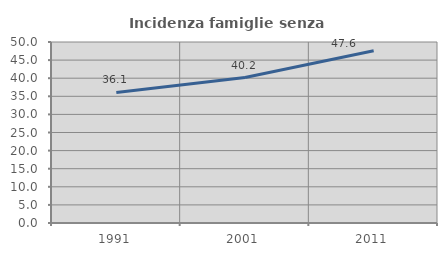
| Category | Incidenza famiglie senza nuclei |
|---|---|
| 1991.0 | 36.05 |
| 2001.0 | 40.179 |
| 2011.0 | 47.571 |